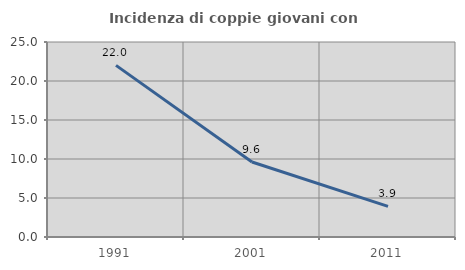
| Category | Incidenza di coppie giovani con figli |
|---|---|
| 1991.0 | 22 |
| 2001.0 | 9.615 |
| 2011.0 | 3.922 |